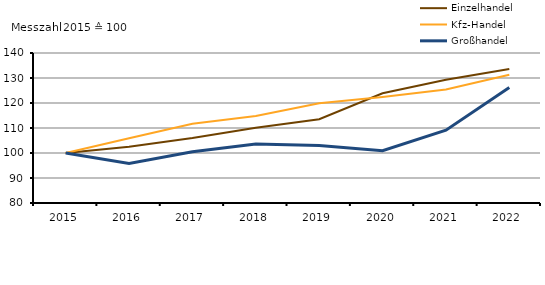
| Category | Einzelhandel | Kfz-Handel | Großhandel |
|---|---|---|---|
| 2015.0 | 100 | 100 | 100 |
| 2016.0 | 102.5 | 105.9 | 95.8 |
| 2017.0 | 106 | 111.7 | 100.5 |
| 2018.0 | 110.1 | 114.8 | 103.6 |
| 2019.0 | 113.5 | 119.9 | 103 |
| 2020.0 | 123.9 | 122.4 | 100.9 |
| 2021.0 | 129.3 | 125.4 | 109.1 |
| 2022.0 | 133.6 | 131.3 | 126.2 |